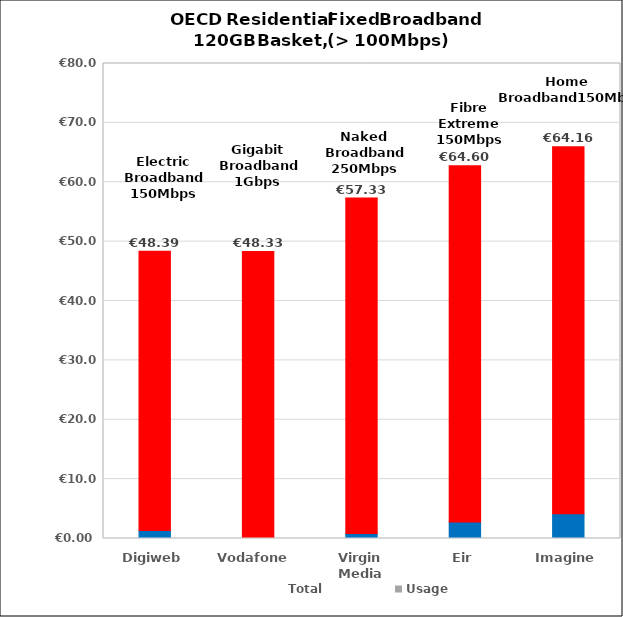
| Category | Non-rec | Monthly | Usage | Total |
|---|---|---|---|---|
| Digiweb | 1.361 | 47.033 | 0 | 48.394 |
| Vodafone  | 0 | 48.33 | 0 | 48.33 |
| Virgin Media | 0.83 | 56.5 | 0 | 57.33 |
| Eir | 2.78 | 59.99 | 0 | 64.6 |
| Imagine | 4.167 | 61.82 | 0 | 64.157 |